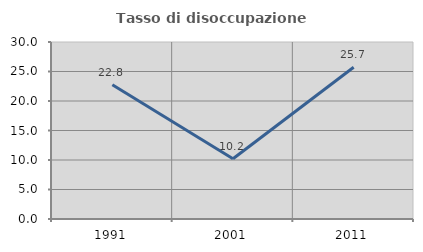
| Category | Tasso di disoccupazione giovanile  |
|---|---|
| 1991.0 | 22.759 |
| 2001.0 | 10.204 |
| 2011.0 | 25.728 |